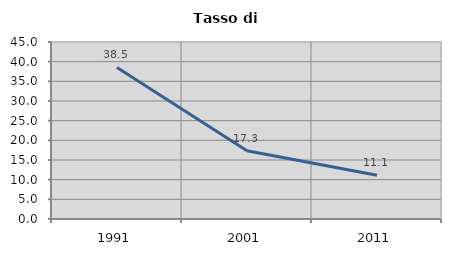
| Category | Tasso di disoccupazione   |
|---|---|
| 1991.0 | 38.54 |
| 2001.0 | 17.337 |
| 2011.0 | 11.111 |